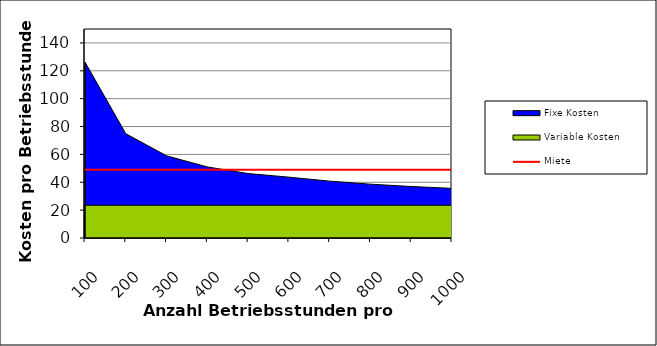
| Category | Miete |
|---|---|
| 0 | 49 |
| 1 | 49 |
| 2 | 49 |
| 3 | 49 |
| 4 | 49 |
| 5 | 49 |
| 6 | 49 |
| 7 | 49 |
| 8 | 49 |
| 9 | 49 |